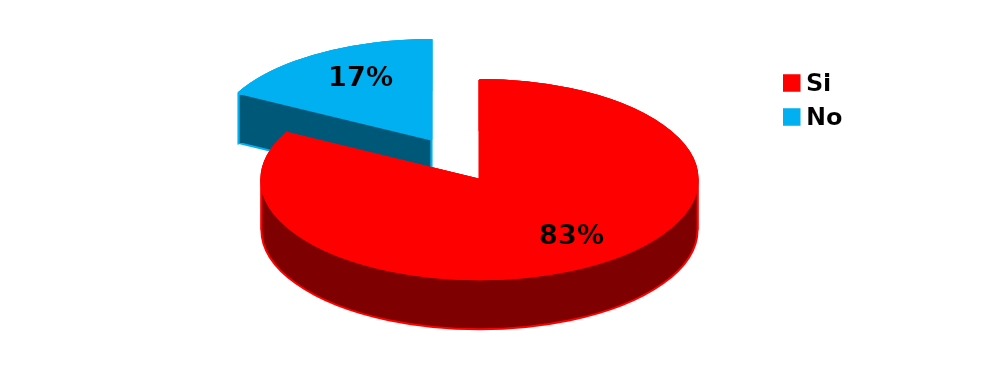
| Category | Series 0 |
|---|---|
| Si | 48 |
| No | 10 |